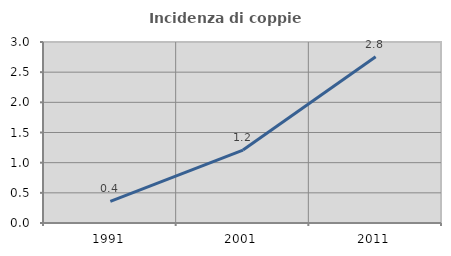
| Category | Incidenza di coppie miste |
|---|---|
| 1991.0 | 0.357 |
| 2001.0 | 1.209 |
| 2011.0 | 2.755 |